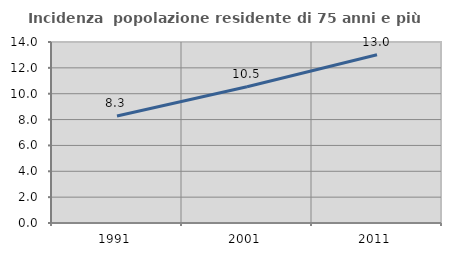
| Category | Incidenza  popolazione residente di 75 anni e più |
|---|---|
| 1991.0 | 8.274 |
| 2001.0 | 10.536 |
| 2011.0 | 13.011 |